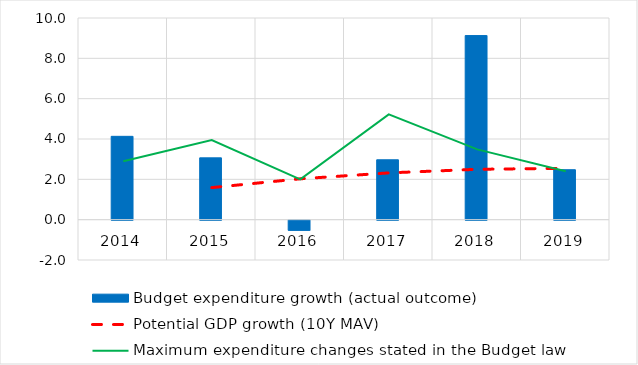
| Category | Budget expenditure growth (actual outcome) |
|---|---|
| 2014.0 | 4.132 |
| 2015.0 | 3.065 |
| 2016.0 | -0.502 |
| 2017.0 | 2.969 |
| 2018.0 | 9.129 |
| 2019.0 | 2.477 |